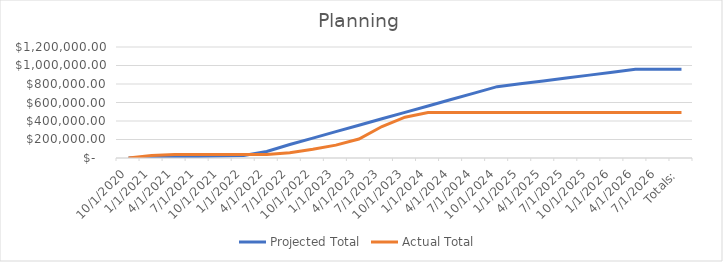
| Category | Projected Total | Actual Total  |
|---|---|---|
| 10/1/2020 | 0 | 0 |
| 1/1/2021 | 5467.429 | 26417 |
| 4/1/2021 | 10934.857 | 38272 |
| 7/1/2021 | 16402.286 | 38272 |
| 10/1/2021 | 21869.714 | 38272 |
| 1/1/2022 | 27337.143 | 38272 |
| 4/1/2022 | 71009.662 | 38272 |
| 7/1/2022 | 145932.182 | 56682 |
| 10/1/2022 | 215387.273 | 94111.54 |
| 1/1/2023 | 284842.364 | 139179.07 |
| 4/1/2023 | 354297.455 | 204957.86 |
| 7/1/2023 | 423752.545 | 340479.97 |
| 10/1/2023 | 493207.636 | 441472.89 |
| 1/1/2024 | 562662.727 | 491345.38 |
| 4/1/2024 | 632117.818 | 491345.38 |
| 7/1/2024 | 701572.909 | 491345.38 |
| 10/1/2024 | 771028 | 491345.38 |
| 1/1/2025 | 802278 | 491345.38 |
| 4/1/2025 | 833528 | 491345.38 |
| 7/1/2025 | 864778 | 491345.38 |
| 10/1/2025 | 896028 | 491345.38 |
| 1/1/2026 | 927278 | 491345.38 |
| 4/1/2026 | 958528 | 491345.38 |
| 7/1/2026 | 958528 | 491345.38 |
| Totals: | 958528 | 491345.38 |